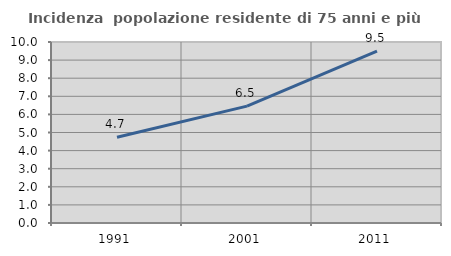
| Category | Incidenza  popolazione residente di 75 anni e più |
|---|---|
| 1991.0 | 4.741 |
| 2001.0 | 6.456 |
| 2011.0 | 9.492 |